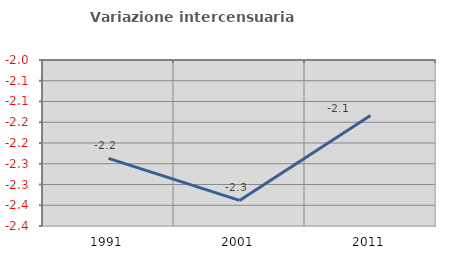
| Category | Variazione intercensuaria annua |
|---|---|
| 1991.0 | -2.237 |
| 2001.0 | -2.338 |
| 2011.0 | -2.134 |